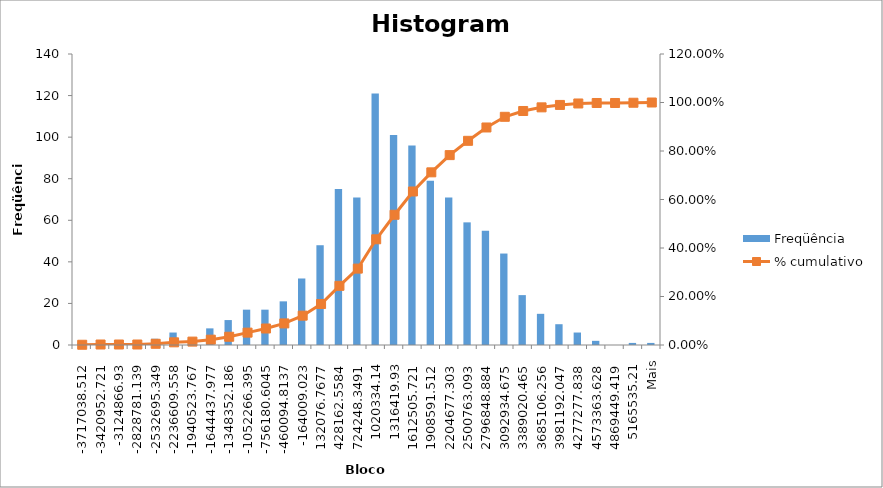
| Category | Freqüência |
|---|---|
| -3717038,512 | 1 |
| -3420952,721 | 1 |
| -3124866,93 | 0 |
| -2828781,139 | 0 |
| -2532695,349 | 3 |
| -2236609,558 | 6 |
| -1940523,767 | 3 |
| -1644437,977 | 8 |
| -1348352,186 | 12 |
| -1052266,395 | 17 |
| -756180,6045 | 17 |
| -460094,8137 | 21 |
| -164009,023 | 32 |
| 132076,7677 | 48 |
| 428162,5584 | 75 |
| 724248,3491 | 71 |
| 1020334,14 | 121 |
| 1316419,93 | 101 |
| 1612505,721 | 96 |
| 1908591,512 | 79 |
| 2204677,303 | 71 |
| 2500763,093 | 59 |
| 2796848,884 | 55 |
| 3092934,675 | 44 |
| 3389020,465 | 24 |
| 3685106,256 | 15 |
| 3981192,047 | 10 |
| 4277277,838 | 6 |
| 4573363,628 | 2 |
| 4869449,419 | 0 |
| 5165535,21 | 1 |
| Mais | 1 |